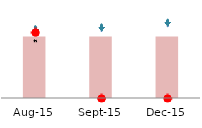
| Category | Series 1 |
|---|---|
| 2015-08-01 | 128.208 |
| 2015-09-01 | 128.208 |
| 2015-12-01 | 128.208 |